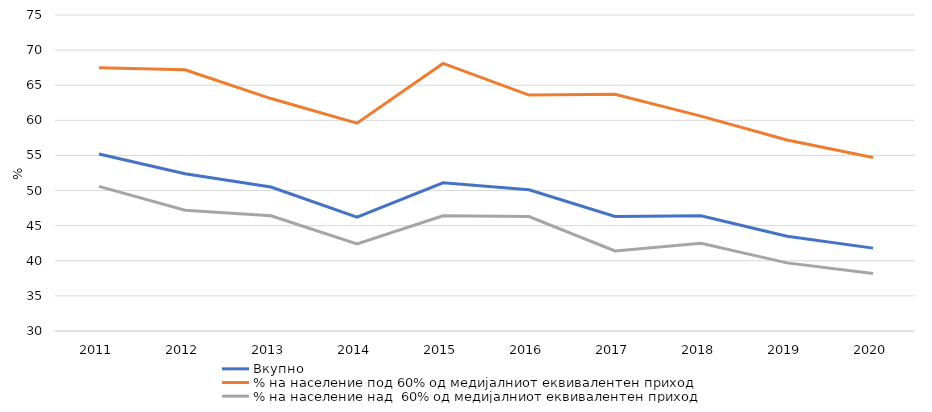
| Category | Вкупно  | % на население под 60% од медијалниот еквивалентен приход | % на население над  60% од медијалниот еквивалентен приход |
|---|---|---|---|
| 2011 | 55.2 | 67.5 | 50.6 |
| 2012 | 52.4 | 67.2 | 47.2 |
| 2013 | 50.5 | 63.1 | 46.4 |
| 2014 | 46.2 | 59.6 | 42.4 |
| 2015 | 51.1 | 68.1 | 46.4 |
| 2016 | 50.1 | 63.6 | 46.3 |
| 2017 | 46.3 | 63.7 | 41.4 |
| 2018 | 46.4 | 60.6 | 42.5 |
| 2019 | 43.5 | 57.2 | 39.7 |
| 2020 | 41.8 | 54.7 | 38.2 |